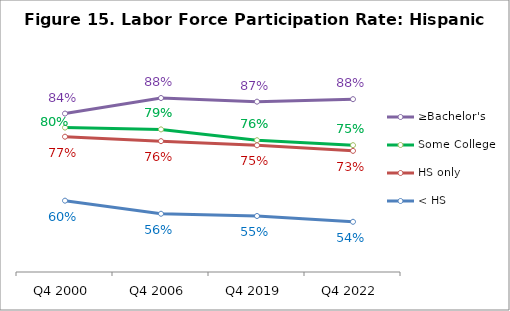
| Category | ≥Bachelor's | Some College | HS only | < HS |
|---|---|---|---|---|
| Q4 2000 | 0.838 | 0.799 | 0.774 | 0.597 |
| Q4 2006 | 0.881 | 0.794 | 0.762 | 0.561 |
| Q4 2019 | 0.871 | 0.764 | 0.75 | 0.555 |
| Q4 2022 | 0.878 | 0.751 | 0.735 | 0.539 |